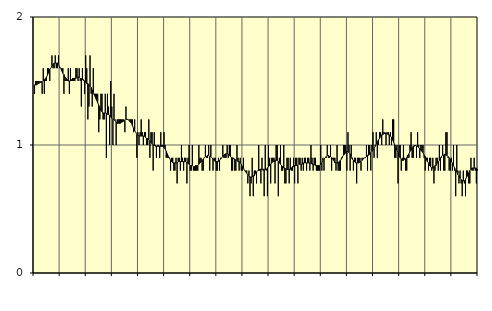
| Category | Jordbruk, skogsbruk o fiske, SNI 01-03 | Series 1 |
|---|---|---|
| nan | 1.4 | 1.47 |
| 87.0 | 1.5 | 1.47 |
| 87.0 | 1.5 | 1.47 |
| 87.0 | 1.5 | 1.48 |
| 87.0 | 1.5 | 1.48 |
| 87.0 | 1.5 | 1.49 |
| 87.0 | 1.5 | 1.49 |
| 87.0 | 1.4 | 1.49 |
| 87.0 | 1.6 | 1.5 |
| 87.0 | 1.4 | 1.51 |
| 87.0 | 1.5 | 1.52 |
| 87.0 | 1.5 | 1.53 |
| nan | 1.6 | 1.55 |
| 88.0 | 1.6 | 1.57 |
| 88.0 | 1.5 | 1.59 |
| 88.0 | 1.6 | 1.6 |
| 88.0 | 1.7 | 1.62 |
| 88.0 | 1.6 | 1.63 |
| 88.0 | 1.6 | 1.64 |
| 88.0 | 1.7 | 1.64 |
| 88.0 | 1.6 | 1.64 |
| 88.0 | 1.6 | 1.64 |
| 88.0 | 1.7 | 1.63 |
| 88.0 | 1.6 | 1.61 |
| nan | 1.6 | 1.6 |
| 89.0 | 1.6 | 1.58 |
| 89.0 | 1.6 | 1.56 |
| 89.0 | 1.4 | 1.55 |
| 89.0 | 1.5 | 1.53 |
| 89.0 | 1.5 | 1.52 |
| 89.0 | 1.5 | 1.51 |
| 89.0 | 1.6 | 1.5 |
| 89.0 | 1.4 | 1.5 |
| 89.0 | 1.6 | 1.5 |
| 89.0 | 1.5 | 1.51 |
| 89.0 | 1.5 | 1.52 |
| nan | 1.5 | 1.52 |
| 90.0 | 1.5 | 1.52 |
| 90.0 | 1.6 | 1.52 |
| 90.0 | 1.6 | 1.53 |
| 90.0 | 1.5 | 1.53 |
| 90.0 | 1.6 | 1.53 |
| 90.0 | 1.5 | 1.52 |
| 90.0 | 1.3 | 1.52 |
| 90.0 | 1.6 | 1.51 |
| 90.0 | 1.5 | 1.51 |
| 90.0 | 1.4 | 1.5 |
| 90.0 | 1.7 | 1.49 |
| nan | 1.6 | 1.48 |
| 91.0 | 1.2 | 1.48 |
| 91.0 | 1.3 | 1.47 |
| 91.0 | 1.7 | 1.46 |
| 91.0 | 1.4 | 1.45 |
| 91.0 | 1.3 | 1.43 |
| 91.0 | 1.6 | 1.41 |
| 91.0 | 1.4 | 1.39 |
| 91.0 | 1.4 | 1.37 |
| 91.0 | 1.4 | 1.35 |
| 91.0 | 1.4 | 1.33 |
| 91.0 | 1.1 | 1.31 |
| nan | 1.2 | 1.29 |
| 92.0 | 1.4 | 1.27 |
| 92.0 | 1.4 | 1.26 |
| 92.0 | 1.2 | 1.25 |
| 92.0 | 1.2 | 1.25 |
| 92.0 | 1.4 | 1.25 |
| 92.0 | 0.9 | 1.25 |
| 92.0 | 1.4 | 1.24 |
| 92.0 | 1.3 | 1.24 |
| 92.0 | 1 | 1.23 |
| 92.0 | 1.5 | 1.22 |
| 92.0 | 1.3 | 1.21 |
| nan | 1 | 1.2 |
| 93.0 | 1.4 | 1.2 |
| 93.0 | 1.2 | 1.19 |
| 93.0 | 1 | 1.18 |
| 93.0 | 1.2 | 1.17 |
| 93.0 | 1.2 | 1.17 |
| 93.0 | 1.2 | 1.17 |
| 93.0 | 1.2 | 1.17 |
| 93.0 | 1.2 | 1.18 |
| 93.0 | 1.2 | 1.18 |
| 93.0 | 1.2 | 1.19 |
| 93.0 | 1.1 | 1.19 |
| nan | 1.3 | 1.2 |
| 94.0 | 1.2 | 1.2 |
| 94.0 | 1.2 | 1.2 |
| 94.0 | 1.2 | 1.19 |
| 94.0 | 1.2 | 1.18 |
| 94.0 | 1.2 | 1.17 |
| 94.0 | 1.2 | 1.15 |
| 94.0 | 1.1 | 1.13 |
| 94.0 | 1.2 | 1.11 |
| 94.0 | 1.1 | 1.1 |
| 94.0 | 0.9 | 1.08 |
| 94.0 | 1.1 | 1.08 |
| nan | 1 | 1.07 |
| 95.0 | 1.1 | 1.07 |
| 95.0 | 1.2 | 1.07 |
| 95.0 | 1.1 | 1.07 |
| 95.0 | 1 | 1.07 |
| 95.0 | 1.1 | 1.07 |
| 95.0 | 1.1 | 1.06 |
| 95.0 | 1 | 1.05 |
| 95.0 | 1 | 1.05 |
| 95.0 | 1.2 | 1.04 |
| 95.0 | 0.9 | 1.03 |
| 95.0 | 1.1 | 1.02 |
| nan | 1.1 | 1.01 |
| 96.0 | 0.8 | 1 |
| 96.0 | 1.1 | 1 |
| 96.0 | 1 | 0.99 |
| 96.0 | 0.9 | 0.99 |
| 96.0 | 1 | 0.99 |
| 96.0 | 1 | 0.99 |
| 96.0 | 0.9 | 0.99 |
| 96.0 | 1.1 | 0.99 |
| 96.0 | 1 | 0.99 |
| 96.0 | 1 | 0.99 |
| 96.0 | 1.1 | 0.98 |
| nan | 1 | 0.97 |
| 97.0 | 0.9 | 0.95 |
| 97.0 | 0.9 | 0.93 |
| 97.0 | 0.9 | 0.91 |
| 97.0 | 0.9 | 0.9 |
| 97.0 | 0.8 | 0.88 |
| 97.0 | 0.9 | 0.87 |
| 97.0 | 0.9 | 0.86 |
| 97.0 | 0.8 | 0.86 |
| 97.0 | 0.8 | 0.86 |
| 97.0 | 0.9 | 0.86 |
| 97.0 | 0.7 | 0.86 |
| nan | 0.9 | 0.87 |
| 98.0 | 0.9 | 0.87 |
| 98.0 | 0.8 | 0.87 |
| 98.0 | 1 | 0.87 |
| 98.0 | 0.9 | 0.87 |
| 98.0 | 0.8 | 0.87 |
| 98.0 | 0.9 | 0.87 |
| 98.0 | 0.9 | 0.87 |
| 98.0 | 0.7 | 0.86 |
| 98.0 | 0.9 | 0.86 |
| 98.0 | 1 | 0.85 |
| 98.0 | 0.8 | 0.84 |
| nan | 0.8 | 0.84 |
| 99.0 | 1 | 0.84 |
| 99.0 | 0.8 | 0.83 |
| 99.0 | 0.8 | 0.83 |
| 99.0 | 0.8 | 0.84 |
| 99.0 | 0.8 | 0.84 |
| 99.0 | 0.8 | 0.84 |
| 99.0 | 1 | 0.85 |
| 99.0 | 0.9 | 0.86 |
| 99.0 | 0.9 | 0.87 |
| 99.0 | 0.8 | 0.88 |
| 99.0 | 0.8 | 0.89 |
| nan | 0.9 | 0.9 |
| 0.0 | 1 | 0.91 |
| 0.0 | 0.9 | 0.91 |
| 0.0 | 0.9 | 0.92 |
| 0.0 | 1 | 0.92 |
| 0.0 | 0.8 | 0.91 |
| 0.0 | 1 | 0.91 |
| 0.0 | 0.9 | 0.9 |
| 0.0 | 0.8 | 0.89 |
| 0.0 | 0.9 | 0.88 |
| 0.0 | 0.9 | 0.87 |
| 0.0 | 0.8 | 0.87 |
| nan | 0.8 | 0.87 |
| 1.0 | 0.9 | 0.87 |
| 1.0 | 0.8 | 0.88 |
| 1.0 | 0.9 | 0.89 |
| 1.0 | 0.9 | 0.9 |
| 1.0 | 1 | 0.91 |
| 1.0 | 0.9 | 0.92 |
| 1.0 | 0.9 | 0.93 |
| 1.0 | 0.9 | 0.93 |
| 1.0 | 1 | 0.93 |
| 1.0 | 0.9 | 0.93 |
| 1.0 | 1 | 0.92 |
| nan | 1 | 0.91 |
| 2.0 | 0.8 | 0.9 |
| 2.0 | 0.8 | 0.9 |
| 2.0 | 0.9 | 0.89 |
| 2.0 | 0.8 | 0.89 |
| 2.0 | 0.8 | 0.88 |
| 2.0 | 1 | 0.88 |
| 2.0 | 0.9 | 0.87 |
| 2.0 | 0.8 | 0.87 |
| 2.0 | 0.9 | 0.86 |
| 2.0 | 0.8 | 0.85 |
| 2.0 | 0.8 | 0.83 |
| nan | 0.9 | 0.82 |
| 3.0 | 0.8 | 0.8 |
| 3.0 | 0.8 | 0.79 |
| 3.0 | 0.8 | 0.78 |
| 3.0 | 0.7 | 0.76 |
| 3.0 | 0.8 | 0.76 |
| 3.0 | 0.6 | 0.75 |
| 3.0 | 0.7 | 0.75 |
| 3.0 | 0.9 | 0.75 |
| 3.0 | 0.6 | 0.76 |
| 3.0 | 0.8 | 0.76 |
| 3.0 | 0.8 | 0.78 |
| nan | 0.7 | 0.79 |
| 4.0 | 0.8 | 0.8 |
| 4.0 | 1 | 0.8 |
| 4.0 | 0.8 | 0.81 |
| 4.0 | 0.7 | 0.81 |
| 4.0 | 0.9 | 0.81 |
| 4.0 | 0.8 | 0.81 |
| 4.0 | 0.6 | 0.81 |
| 4.0 | 1 | 0.81 |
| 4.0 | 0.8 | 0.81 |
| 4.0 | 0.6 | 0.82 |
| 4.0 | 1 | 0.83 |
| nan | 0.9 | 0.84 |
| 5.0 | 0.7 | 0.85 |
| 5.0 | 0.9 | 0.86 |
| 5.0 | 0.9 | 0.87 |
| 5.0 | 0.9 | 0.87 |
| 5.0 | 0.7 | 0.88 |
| 5.0 | 1 | 0.88 |
| 5.0 | 1 | 0.88 |
| 5.0 | 0.6 | 0.87 |
| 5.0 | 0.9 | 0.86 |
| 5.0 | 1 | 0.85 |
| 5.0 | 0.8 | 0.84 |
| nan | 0.8 | 0.83 |
| 6.0 | 1 | 0.82 |
| 6.0 | 0.7 | 0.82 |
| 6.0 | 0.7 | 0.81 |
| 6.0 | 0.9 | 0.81 |
| 6.0 | 0.9 | 0.81 |
| 6.0 | 0.7 | 0.81 |
| 6.0 | 0.9 | 0.81 |
| 6.0 | 0.8 | 0.82 |
| 6.0 | 0.8 | 0.83 |
| 6.0 | 0.9 | 0.83 |
| 6.0 | 0.7 | 0.84 |
| nan | 0.9 | 0.84 |
| 7.0 | 0.9 | 0.84 |
| 7.0 | 0.7 | 0.84 |
| 7.0 | 0.9 | 0.85 |
| 7.0 | 0.9 | 0.85 |
| 7.0 | 0.8 | 0.85 |
| 7.0 | 0.9 | 0.85 |
| 7.0 | 0.8 | 0.86 |
| 7.0 | 0.9 | 0.86 |
| 7.0 | 0.9 | 0.86 |
| 7.0 | 0.8 | 0.86 |
| 7.0 | 0.9 | 0.86 |
| nan | 0.9 | 0.86 |
| 8.0 | 0.8 | 0.86 |
| 8.0 | 1 | 0.86 |
| 8.0 | 0.9 | 0.85 |
| 8.0 | 0.8 | 0.85 |
| 8.0 | 0.9 | 0.85 |
| 8.0 | 0.9 | 0.84 |
| 8.0 | 0.8 | 0.84 |
| 8.0 | 0.8 | 0.84 |
| 8.0 | 0.8 | 0.84 |
| 8.0 | 0.8 | 0.84 |
| 8.0 | 1 | 0.85 |
| nan | 0.8 | 0.86 |
| 9.0 | 0.9 | 0.88 |
| 9.0 | 0.8 | 0.89 |
| 9.0 | 0.9 | 0.9 |
| 9.0 | 0.9 | 0.91 |
| 9.0 | 1 | 0.92 |
| 9.0 | 0.9 | 0.92 |
| 9.0 | 0.9 | 0.91 |
| 9.0 | 1 | 0.91 |
| 9.0 | 0.8 | 0.9 |
| 9.0 | 0.9 | 0.89 |
| 9.0 | 0.9 | 0.88 |
| nan | 0.9 | 0.86 |
| 10.0 | 0.8 | 0.86 |
| 10.0 | 1 | 0.86 |
| 10.0 | 0.8 | 0.86 |
| 10.0 | 0.8 | 0.87 |
| 10.0 | 0.8 | 0.88 |
| 10.0 | 0.9 | 0.89 |
| 10.0 | 0.9 | 0.91 |
| 10.0 | 1 | 0.92 |
| 10.0 | 1 | 0.93 |
| 10.0 | 1 | 0.94 |
| 10.0 | 0.8 | 0.95 |
| nan | 1.1 | 0.95 |
| 11.0 | 1 | 0.94 |
| 11.0 | 0.8 | 0.93 |
| 11.0 | 1 | 0.91 |
| 11.0 | 0.9 | 0.89 |
| 11.0 | 0.8 | 0.88 |
| 11.0 | 0.9 | 0.87 |
| 11.0 | 0.9 | 0.86 |
| 11.0 | 0.7 | 0.86 |
| 11.0 | 0.9 | 0.86 |
| 11.0 | 0.9 | 0.86 |
| 11.0 | 0.9 | 0.87 |
| nan | 0.8 | 0.87 |
| 12.0 | 0.9 | 0.88 |
| 12.0 | 0.9 | 0.89 |
| 12.0 | 0.9 | 0.9 |
| 12.0 | 0.9 | 0.9 |
| 12.0 | 1 | 0.91 |
| 12.0 | 0.8 | 0.92 |
| 12.0 | 1 | 0.92 |
| 12.0 | 1 | 0.93 |
| 12.0 | 0.8 | 0.94 |
| 12.0 | 1 | 0.95 |
| 12.0 | 1.1 | 0.96 |
| nan | 0.9 | 0.97 |
| 13.0 | 1 | 0.99 |
| 13.0 | 1.1 | 1.01 |
| 13.0 | 0.9 | 1.02 |
| 13.0 | 1 | 1.04 |
| 13.0 | 1.1 | 1.05 |
| 13.0 | 1.1 | 1.07 |
| 13.0 | 1 | 1.08 |
| 13.0 | 1.2 | 1.08 |
| 13.0 | 1.1 | 1.09 |
| 13.0 | 1.1 | 1.09 |
| 13.0 | 1 | 1.09 |
| nan | 1.1 | 1.09 |
| 14.0 | 1.1 | 1.08 |
| 14.0 | 1 | 1.08 |
| 14.0 | 1.1 | 1.07 |
| 14.0 | 1 | 1.06 |
| 14.0 | 1.2 | 1.04 |
| 14.0 | 1.2 | 1.02 |
| 14.0 | 0.9 | 1 |
| 14.0 | 0.9 | 0.98 |
| 14.0 | 1 | 0.96 |
| 14.0 | 0.7 | 0.94 |
| 14.0 | 1 | 0.92 |
| nan | 1 | 0.9 |
| 15.0 | 0.8 | 0.89 |
| 15.0 | 0.9 | 0.88 |
| 15.0 | 1 | 0.88 |
| 15.0 | 0.9 | 0.89 |
| 15.0 | 0.8 | 0.89 |
| 15.0 | 0.8 | 0.9 |
| 15.0 | 0.9 | 0.92 |
| 15.0 | 0.9 | 0.93 |
| 15.0 | 1 | 0.95 |
| 15.0 | 1.1 | 0.96 |
| 15.0 | 0.9 | 0.98 |
| nan | 0.9 | 0.99 |
| 16.0 | 1 | 0.99 |
| 16.0 | 1 | 1 |
| 16.0 | 0.9 | 0.99 |
| 16.0 | 1.1 | 0.99 |
| 16.0 | 1 | 0.98 |
| 16.0 | 0.9 | 0.97 |
| 16.0 | 1 | 0.96 |
| 16.0 | 1 | 0.95 |
| 16.0 | 1 | 0.94 |
| 16.0 | 0.9 | 0.92 |
| 16.0 | 0.8 | 0.91 |
| nan | 0.9 | 0.89 |
| 17.0 | 0.9 | 0.87 |
| 17.0 | 0.8 | 0.86 |
| 17.0 | 0.9 | 0.84 |
| 17.0 | 0.9 | 0.83 |
| 17.0 | 0.8 | 0.82 |
| 17.0 | 0.9 | 0.82 |
| 17.0 | 0.7 | 0.83 |
| 17.0 | 0.8 | 0.84 |
| 17.0 | 0.9 | 0.84 |
| 17.0 | 0.9 | 0.86 |
| 17.0 | 0.8 | 0.87 |
| nan | 1 | 0.88 |
| 18.0 | 0.8 | 0.9 |
| 18.0 | 0.9 | 0.91 |
| 18.0 | 1 | 0.92 |
| 18.0 | 0.8 | 0.92 |
| 18.0 | 0.8 | 0.93 |
| 18.0 | 1.1 | 0.92 |
| 18.0 | 1.1 | 0.92 |
| 18.0 | 0.9 | 0.91 |
| 18.0 | 0.8 | 0.9 |
| 18.0 | 0.8 | 0.89 |
| 18.0 | 0.9 | 0.87 |
| nan | 0.8 | 0.86 |
| 19.0 | 1 | 0.84 |
| 19.0 | 0.8 | 0.82 |
| 19.0 | 0.6 | 0.8 |
| 19.0 | 1 | 0.79 |
| 19.0 | 0.8 | 0.77 |
| 19.0 | 0.7 | 0.76 |
| 19.0 | 0.8 | 0.74 |
| 19.0 | 0.7 | 0.73 |
| 19.0 | 0.6 | 0.72 |
| 19.0 | 0.8 | 0.72 |
| 19.0 | 0.7 | 0.72 |
| nan | 0.6 | 0.73 |
| 20.0 | 0.8 | 0.75 |
| 20.0 | 0.8 | 0.76 |
| 20.0 | 0.7 | 0.78 |
| 20.0 | 0.7 | 0.8 |
| 20.0 | 0.9 | 0.81 |
| 20.0 | 0.8 | 0.82 |
| 20.0 | 0.8 | 0.82 |
| 20.0 | 0.9 | 0.82 |
| 20.0 | 0.8 | 0.82 |
| 20.0 | 0.7 | 0.82 |
| 20.0 | 0.8 | 0.81 |